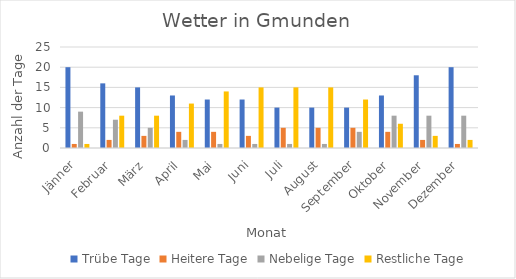
| Category | Trübe Tage | Heitere Tage | Nebelige Tage | Restliche Tage |
|---|---|---|---|---|
| Jänner | 20 | 1 | 9 | 1 |
| Februar | 16 | 2 | 7 | 8 |
| März | 15 | 3 | 5 | 8 |
| April | 13 | 4 | 2 | 11 |
| Mai | 12 | 4 | 1 | 14 |
| Juni | 12 | 3 | 1 | 15 |
| Juli | 10 | 5 | 1 | 15 |
| August | 10 | 5 | 1 | 15 |
| September | 10 | 5 | 4 | 12 |
| Oktober | 13 | 4 | 8 | 6 |
| November | 18 | 2 | 8 | 3 |
| Dezember | 20 | 1 | 8 | 2 |